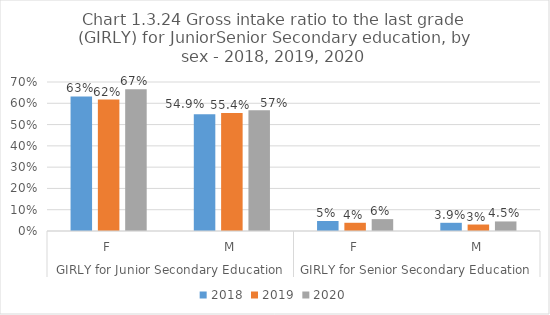
| Category | 2018 | 2019 | 2020 |
|---|---|---|---|
| 0 | 0.632 | 0.617 | 0.666 |
| 1 | 0.549 | 0.554 | 0.567 |
| 2 | 0.047 | 0.039 | 0.056 |
| 3 | 0.039 | 0.03 | 0.045 |